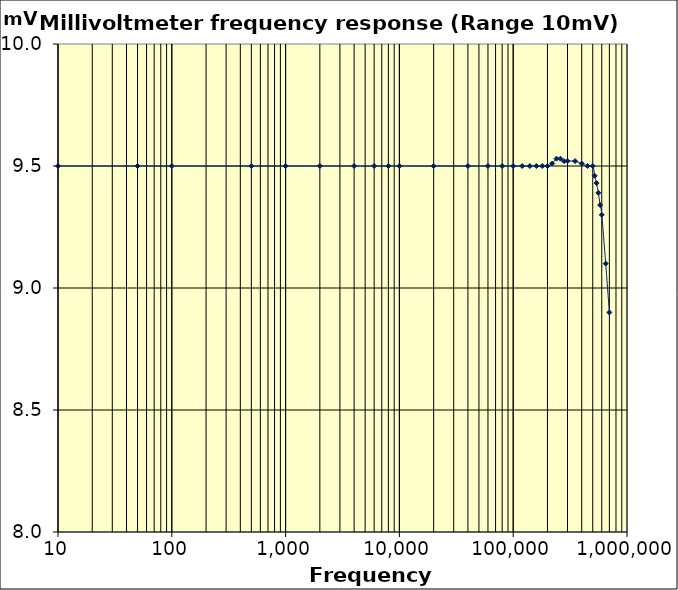
| Category | Series 0 |
|---|---|
| 10.0 | 9.5 |
| 50.0 | 9.5 |
| 100.0 | 9.5 |
| 500.0 | 9.5 |
| 1000.0 | 9.5 |
| 2000.0 | 9.5 |
| 4000.0 | 9.5 |
| 6000.0 | 9.5 |
| 8000.0 | 9.5 |
| 10000.0 | 9.5 |
| 20000.0 | 9.5 |
| 40000.0 | 9.5 |
| 60000.0 | 9.5 |
| 80000.0 | 9.5 |
| 100000.0 | 9.5 |
| 120000.0 | 9.5 |
| 140000.0 | 9.5 |
| 160000.0 | 9.5 |
| 180000.0 | 9.5 |
| 200000.0 | 9.5 |
| 220000.0 | 9.51 |
| 240000.0 | 9.53 |
| 260000.0 | 9.53 |
| 280000.0 | 9.52 |
| 300000.0 | 9.52 |
| 350000.0 | 9.52 |
| 400000.0 | 9.51 |
| 450000.0 | 9.5 |
| 500000.0 | 9.5 |
| 520000.0 | 9.46 |
| 540000.0 | 9.43 |
| 560000.0 | 9.39 |
| 580000.0 | 9.34 |
| 600000.0 | 9.3 |
| 650000.0 | 9.1 |
| 700000.0 | 8.9 |